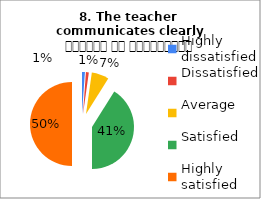
| Category | 8. The teacher 
communicates clearly शिक्षक का सम्प्रेषण सुस्पष्ट है |
|---|---|
| Highly dissatisfied | 1 |
| Dissatisfied | 1 |
| Average | 6 |
| Satisfied | 37 |
| Highly satisfied | 45 |